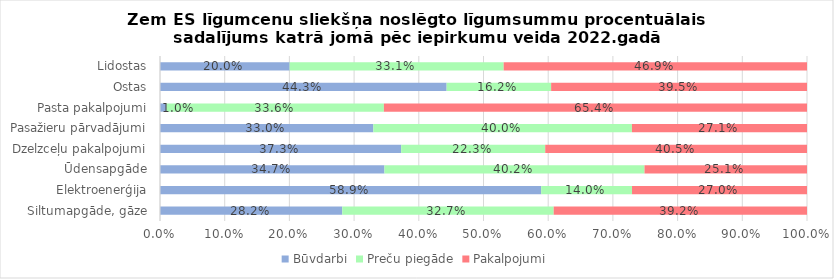
| Category | Būvdarbi | Series 2 | Preču piegāde | Series 4 | Pakalpojumi |
|---|---|---|---|---|---|
| Siltumapgāde, gāze | 0.282 |  | 0.327 |  | 0.392 |
| Elektroenerģija | 0.589 |  | 0.14 |  | 0.27 |
| Ūdensapgāde | 0.347 |  | 0.402 |  | 0.251 |
| Dzelzceļu pakalpojumi | 0.373 |  | 0.223 |  | 0.405 |
| Pasažieru pārvadājumi | 0.33 |  | 0.4 |  | 0.271 |
| Pasta pakalpojumi | 0.01 |  | 0.336 |  | 0.654 |
| Ostas | 0.443 |  | 0.162 |  | 0.395 |
| Lidostas | 0.2 |  | 0.331 |  | 0.469 |